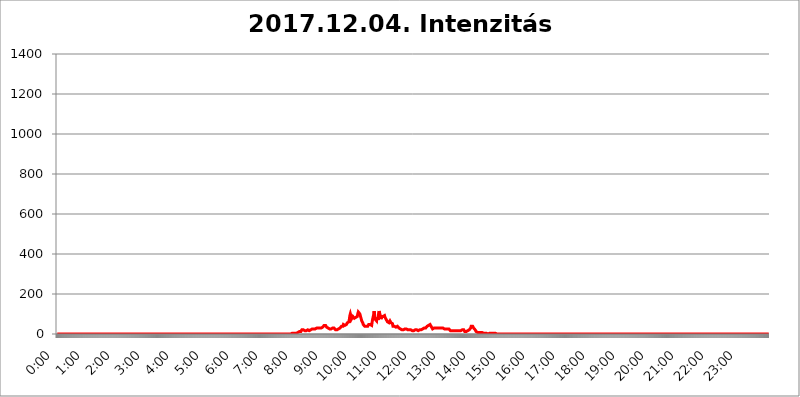
| Category | 2017.12.04. Intenzitás [W/m^2] |
|---|---|
| 0.0 | 0 |
| 0.0006944444444444445 | 0 |
| 0.001388888888888889 | 0 |
| 0.0020833333333333333 | 0 |
| 0.002777777777777778 | 0 |
| 0.003472222222222222 | 0 |
| 0.004166666666666667 | 0 |
| 0.004861111111111111 | 0 |
| 0.005555555555555556 | 0 |
| 0.0062499999999999995 | 0 |
| 0.006944444444444444 | 0 |
| 0.007638888888888889 | 0 |
| 0.008333333333333333 | 0 |
| 0.009027777777777779 | 0 |
| 0.009722222222222222 | 0 |
| 0.010416666666666666 | 0 |
| 0.011111111111111112 | 0 |
| 0.011805555555555555 | 0 |
| 0.012499999999999999 | 0 |
| 0.013194444444444444 | 0 |
| 0.013888888888888888 | 0 |
| 0.014583333333333332 | 0 |
| 0.015277777777777777 | 0 |
| 0.015972222222222224 | 0 |
| 0.016666666666666666 | 0 |
| 0.017361111111111112 | 0 |
| 0.018055555555555557 | 0 |
| 0.01875 | 0 |
| 0.019444444444444445 | 0 |
| 0.02013888888888889 | 0 |
| 0.020833333333333332 | 0 |
| 0.02152777777777778 | 0 |
| 0.022222222222222223 | 0 |
| 0.02291666666666667 | 0 |
| 0.02361111111111111 | 0 |
| 0.024305555555555556 | 0 |
| 0.024999999999999998 | 0 |
| 0.025694444444444447 | 0 |
| 0.02638888888888889 | 0 |
| 0.027083333333333334 | 0 |
| 0.027777777777777776 | 0 |
| 0.02847222222222222 | 0 |
| 0.029166666666666664 | 0 |
| 0.029861111111111113 | 0 |
| 0.030555555555555555 | 0 |
| 0.03125 | 0 |
| 0.03194444444444445 | 0 |
| 0.03263888888888889 | 0 |
| 0.03333333333333333 | 0 |
| 0.034027777777777775 | 0 |
| 0.034722222222222224 | 0 |
| 0.035416666666666666 | 0 |
| 0.036111111111111115 | 0 |
| 0.03680555555555556 | 0 |
| 0.0375 | 0 |
| 0.03819444444444444 | 0 |
| 0.03888888888888889 | 0 |
| 0.03958333333333333 | 0 |
| 0.04027777777777778 | 0 |
| 0.04097222222222222 | 0 |
| 0.041666666666666664 | 0 |
| 0.042361111111111106 | 0 |
| 0.04305555555555556 | 0 |
| 0.043750000000000004 | 0 |
| 0.044444444444444446 | 0 |
| 0.04513888888888889 | 0 |
| 0.04583333333333334 | 0 |
| 0.04652777777777778 | 0 |
| 0.04722222222222222 | 0 |
| 0.04791666666666666 | 0 |
| 0.04861111111111111 | 0 |
| 0.049305555555555554 | 0 |
| 0.049999999999999996 | 0 |
| 0.05069444444444445 | 0 |
| 0.051388888888888894 | 0 |
| 0.052083333333333336 | 0 |
| 0.05277777777777778 | 0 |
| 0.05347222222222222 | 0 |
| 0.05416666666666667 | 0 |
| 0.05486111111111111 | 0 |
| 0.05555555555555555 | 0 |
| 0.05625 | 0 |
| 0.05694444444444444 | 0 |
| 0.057638888888888885 | 0 |
| 0.05833333333333333 | 0 |
| 0.05902777777777778 | 0 |
| 0.059722222222222225 | 0 |
| 0.06041666666666667 | 0 |
| 0.061111111111111116 | 0 |
| 0.06180555555555556 | 0 |
| 0.0625 | 0 |
| 0.06319444444444444 | 0 |
| 0.06388888888888888 | 0 |
| 0.06458333333333334 | 0 |
| 0.06527777777777778 | 0 |
| 0.06597222222222222 | 0 |
| 0.06666666666666667 | 0 |
| 0.06736111111111111 | 0 |
| 0.06805555555555555 | 0 |
| 0.06874999999999999 | 0 |
| 0.06944444444444443 | 0 |
| 0.07013888888888889 | 0 |
| 0.07083333333333333 | 0 |
| 0.07152777777777779 | 0 |
| 0.07222222222222223 | 0 |
| 0.07291666666666667 | 0 |
| 0.07361111111111111 | 0 |
| 0.07430555555555556 | 0 |
| 0.075 | 0 |
| 0.07569444444444444 | 0 |
| 0.0763888888888889 | 0 |
| 0.07708333333333334 | 0 |
| 0.07777777777777778 | 0 |
| 0.07847222222222222 | 0 |
| 0.07916666666666666 | 0 |
| 0.0798611111111111 | 0 |
| 0.08055555555555556 | 0 |
| 0.08125 | 0 |
| 0.08194444444444444 | 0 |
| 0.08263888888888889 | 0 |
| 0.08333333333333333 | 0 |
| 0.08402777777777777 | 0 |
| 0.08472222222222221 | 0 |
| 0.08541666666666665 | 0 |
| 0.08611111111111112 | 0 |
| 0.08680555555555557 | 0 |
| 0.08750000000000001 | 0 |
| 0.08819444444444445 | 0 |
| 0.08888888888888889 | 0 |
| 0.08958333333333333 | 0 |
| 0.09027777777777778 | 0 |
| 0.09097222222222222 | 0 |
| 0.09166666666666667 | 0 |
| 0.09236111111111112 | 0 |
| 0.09305555555555556 | 0 |
| 0.09375 | 0 |
| 0.09444444444444444 | 0 |
| 0.09513888888888888 | 0 |
| 0.09583333333333333 | 0 |
| 0.09652777777777777 | 0 |
| 0.09722222222222222 | 0 |
| 0.09791666666666667 | 0 |
| 0.09861111111111111 | 0 |
| 0.09930555555555555 | 0 |
| 0.09999999999999999 | 0 |
| 0.10069444444444443 | 0 |
| 0.1013888888888889 | 0 |
| 0.10208333333333335 | 0 |
| 0.10277777777777779 | 0 |
| 0.10347222222222223 | 0 |
| 0.10416666666666667 | 0 |
| 0.10486111111111111 | 0 |
| 0.10555555555555556 | 0 |
| 0.10625 | 0 |
| 0.10694444444444444 | 0 |
| 0.1076388888888889 | 0 |
| 0.10833333333333334 | 0 |
| 0.10902777777777778 | 0 |
| 0.10972222222222222 | 0 |
| 0.1111111111111111 | 0 |
| 0.11180555555555556 | 0 |
| 0.11180555555555556 | 0 |
| 0.1125 | 0 |
| 0.11319444444444444 | 0 |
| 0.11388888888888889 | 0 |
| 0.11458333333333333 | 0 |
| 0.11527777777777777 | 0 |
| 0.11597222222222221 | 0 |
| 0.11666666666666665 | 0 |
| 0.1173611111111111 | 0 |
| 0.11805555555555557 | 0 |
| 0.11944444444444445 | 0 |
| 0.12013888888888889 | 0 |
| 0.12083333333333333 | 0 |
| 0.12152777777777778 | 0 |
| 0.12222222222222223 | 0 |
| 0.12291666666666667 | 0 |
| 0.12291666666666667 | 0 |
| 0.12361111111111112 | 0 |
| 0.12430555555555556 | 0 |
| 0.125 | 0 |
| 0.12569444444444444 | 0 |
| 0.12638888888888888 | 0 |
| 0.12708333333333333 | 0 |
| 0.16875 | 0 |
| 0.12847222222222224 | 0 |
| 0.12916666666666668 | 0 |
| 0.12986111111111112 | 0 |
| 0.13055555555555556 | 0 |
| 0.13125 | 0 |
| 0.13194444444444445 | 0 |
| 0.1326388888888889 | 0 |
| 0.13333333333333333 | 0 |
| 0.13402777777777777 | 0 |
| 0.13402777777777777 | 0 |
| 0.13472222222222222 | 0 |
| 0.13541666666666666 | 0 |
| 0.1361111111111111 | 0 |
| 0.13749999999999998 | 0 |
| 0.13819444444444443 | 0 |
| 0.1388888888888889 | 0 |
| 0.13958333333333334 | 0 |
| 0.14027777777777778 | 0 |
| 0.14097222222222222 | 0 |
| 0.14166666666666666 | 0 |
| 0.1423611111111111 | 0 |
| 0.14305555555555557 | 0 |
| 0.14375000000000002 | 0 |
| 0.14444444444444446 | 0 |
| 0.1451388888888889 | 0 |
| 0.1451388888888889 | 0 |
| 0.14652777777777778 | 0 |
| 0.14722222222222223 | 0 |
| 0.14791666666666667 | 0 |
| 0.1486111111111111 | 0 |
| 0.14930555555555555 | 0 |
| 0.15 | 0 |
| 0.15069444444444444 | 0 |
| 0.15138888888888888 | 0 |
| 0.15208333333333332 | 0 |
| 0.15277777777777776 | 0 |
| 0.15347222222222223 | 0 |
| 0.15416666666666667 | 0 |
| 0.15486111111111112 | 0 |
| 0.15555555555555556 | 0 |
| 0.15625 | 0 |
| 0.15694444444444444 | 0 |
| 0.15763888888888888 | 0 |
| 0.15833333333333333 | 0 |
| 0.15902777777777777 | 0 |
| 0.15972222222222224 | 0 |
| 0.16041666666666668 | 0 |
| 0.16111111111111112 | 0 |
| 0.16180555555555556 | 0 |
| 0.1625 | 0 |
| 0.16319444444444445 | 0 |
| 0.1638888888888889 | 0 |
| 0.16458333333333333 | 0 |
| 0.16527777777777777 | 0 |
| 0.16597222222222222 | 0 |
| 0.16666666666666666 | 0 |
| 0.1673611111111111 | 0 |
| 0.16805555555555554 | 0 |
| 0.16874999999999998 | 0 |
| 0.16944444444444443 | 0 |
| 0.17013888888888887 | 0 |
| 0.1708333333333333 | 0 |
| 0.17152777777777775 | 0 |
| 0.17222222222222225 | 0 |
| 0.1729166666666667 | 0 |
| 0.17361111111111113 | 0 |
| 0.17430555555555557 | 0 |
| 0.17500000000000002 | 0 |
| 0.17569444444444446 | 0 |
| 0.1763888888888889 | 0 |
| 0.17708333333333334 | 0 |
| 0.17777777777777778 | 0 |
| 0.17847222222222223 | 0 |
| 0.17916666666666667 | 0 |
| 0.1798611111111111 | 0 |
| 0.18055555555555555 | 0 |
| 0.18125 | 0 |
| 0.18194444444444444 | 0 |
| 0.1826388888888889 | 0 |
| 0.18333333333333335 | 0 |
| 0.1840277777777778 | 0 |
| 0.18472222222222223 | 0 |
| 0.18541666666666667 | 0 |
| 0.18611111111111112 | 0 |
| 0.18680555555555556 | 0 |
| 0.1875 | 0 |
| 0.18819444444444444 | 0 |
| 0.18888888888888888 | 0 |
| 0.18958333333333333 | 0 |
| 0.19027777777777777 | 0 |
| 0.1909722222222222 | 0 |
| 0.19166666666666665 | 0 |
| 0.19236111111111112 | 0 |
| 0.19305555555555554 | 0 |
| 0.19375 | 0 |
| 0.19444444444444445 | 0 |
| 0.1951388888888889 | 0 |
| 0.19583333333333333 | 0 |
| 0.19652777777777777 | 0 |
| 0.19722222222222222 | 0 |
| 0.19791666666666666 | 0 |
| 0.1986111111111111 | 0 |
| 0.19930555555555554 | 0 |
| 0.19999999999999998 | 0 |
| 0.20069444444444443 | 0 |
| 0.20138888888888887 | 0 |
| 0.2020833333333333 | 0 |
| 0.2027777777777778 | 0 |
| 0.2034722222222222 | 0 |
| 0.2041666666666667 | 0 |
| 0.20486111111111113 | 0 |
| 0.20555555555555557 | 0 |
| 0.20625000000000002 | 0 |
| 0.20694444444444446 | 0 |
| 0.2076388888888889 | 0 |
| 0.20833333333333334 | 0 |
| 0.20902777777777778 | 0 |
| 0.20972222222222223 | 0 |
| 0.21041666666666667 | 0 |
| 0.2111111111111111 | 0 |
| 0.21180555555555555 | 0 |
| 0.2125 | 0 |
| 0.21319444444444444 | 0 |
| 0.2138888888888889 | 0 |
| 0.21458333333333335 | 0 |
| 0.2152777777777778 | 0 |
| 0.21597222222222223 | 0 |
| 0.21666666666666667 | 0 |
| 0.21736111111111112 | 0 |
| 0.21805555555555556 | 0 |
| 0.21875 | 0 |
| 0.21944444444444444 | 0 |
| 0.22013888888888888 | 0 |
| 0.22083333333333333 | 0 |
| 0.22152777777777777 | 0 |
| 0.2222222222222222 | 0 |
| 0.22291666666666665 | 0 |
| 0.2236111111111111 | 0 |
| 0.22430555555555556 | 0 |
| 0.225 | 0 |
| 0.22569444444444445 | 0 |
| 0.2263888888888889 | 0 |
| 0.22708333333333333 | 0 |
| 0.22777777777777777 | 0 |
| 0.22847222222222222 | 0 |
| 0.22916666666666666 | 0 |
| 0.2298611111111111 | 0 |
| 0.23055555555555554 | 0 |
| 0.23124999999999998 | 0 |
| 0.23194444444444443 | 0 |
| 0.23263888888888887 | 0 |
| 0.2333333333333333 | 0 |
| 0.2340277777777778 | 0 |
| 0.2347222222222222 | 0 |
| 0.2354166666666667 | 0 |
| 0.23611111111111113 | 0 |
| 0.23680555555555557 | 0 |
| 0.23750000000000002 | 0 |
| 0.23819444444444446 | 0 |
| 0.2388888888888889 | 0 |
| 0.23958333333333334 | 0 |
| 0.24027777777777778 | 0 |
| 0.24097222222222223 | 0 |
| 0.24166666666666667 | 0 |
| 0.2423611111111111 | 0 |
| 0.24305555555555555 | 0 |
| 0.24375 | 0 |
| 0.24444444444444446 | 0 |
| 0.24513888888888888 | 0 |
| 0.24583333333333335 | 0 |
| 0.2465277777777778 | 0 |
| 0.24722222222222223 | 0 |
| 0.24791666666666667 | 0 |
| 0.24861111111111112 | 0 |
| 0.24930555555555556 | 0 |
| 0.25 | 0 |
| 0.25069444444444444 | 0 |
| 0.2513888888888889 | 0 |
| 0.2520833333333333 | 0 |
| 0.25277777777777777 | 0 |
| 0.2534722222222222 | 0 |
| 0.25416666666666665 | 0 |
| 0.2548611111111111 | 0 |
| 0.2555555555555556 | 0 |
| 0.25625000000000003 | 0 |
| 0.2569444444444445 | 0 |
| 0.2576388888888889 | 0 |
| 0.25833333333333336 | 0 |
| 0.2590277777777778 | 0 |
| 0.25972222222222224 | 0 |
| 0.2604166666666667 | 0 |
| 0.2611111111111111 | 0 |
| 0.26180555555555557 | 0 |
| 0.2625 | 0 |
| 0.26319444444444445 | 0 |
| 0.2638888888888889 | 0 |
| 0.26458333333333334 | 0 |
| 0.2652777777777778 | 0 |
| 0.2659722222222222 | 0 |
| 0.26666666666666666 | 0 |
| 0.2673611111111111 | 0 |
| 0.26805555555555555 | 0 |
| 0.26875 | 0 |
| 0.26944444444444443 | 0 |
| 0.2701388888888889 | 0 |
| 0.2708333333333333 | 0 |
| 0.27152777777777776 | 0 |
| 0.2722222222222222 | 0 |
| 0.27291666666666664 | 0 |
| 0.2736111111111111 | 0 |
| 0.2743055555555555 | 0 |
| 0.27499999999999997 | 0 |
| 0.27569444444444446 | 0 |
| 0.27638888888888885 | 0 |
| 0.27708333333333335 | 0 |
| 0.2777777777777778 | 0 |
| 0.27847222222222223 | 0 |
| 0.2791666666666667 | 0 |
| 0.2798611111111111 | 0 |
| 0.28055555555555556 | 0 |
| 0.28125 | 0 |
| 0.28194444444444444 | 0 |
| 0.2826388888888889 | 0 |
| 0.2833333333333333 | 0 |
| 0.28402777777777777 | 0 |
| 0.2847222222222222 | 0 |
| 0.28541666666666665 | 0 |
| 0.28611111111111115 | 0 |
| 0.28680555555555554 | 0 |
| 0.28750000000000003 | 0 |
| 0.2881944444444445 | 0 |
| 0.2888888888888889 | 0 |
| 0.28958333333333336 | 0 |
| 0.2902777777777778 | 0 |
| 0.29097222222222224 | 0 |
| 0.2916666666666667 | 0 |
| 0.2923611111111111 | 0 |
| 0.29305555555555557 | 0 |
| 0.29375 | 0 |
| 0.29444444444444445 | 0 |
| 0.2951388888888889 | 0 |
| 0.29583333333333334 | 0 |
| 0.2965277777777778 | 0 |
| 0.2972222222222222 | 0 |
| 0.29791666666666666 | 0 |
| 0.2986111111111111 | 0 |
| 0.29930555555555555 | 0 |
| 0.3 | 0 |
| 0.30069444444444443 | 0 |
| 0.3013888888888889 | 0 |
| 0.3020833333333333 | 0 |
| 0.30277777777777776 | 0 |
| 0.3034722222222222 | 0 |
| 0.30416666666666664 | 0 |
| 0.3048611111111111 | 0 |
| 0.3055555555555555 | 0 |
| 0.30624999999999997 | 0 |
| 0.3069444444444444 | 0 |
| 0.3076388888888889 | 0 |
| 0.30833333333333335 | 0 |
| 0.3090277777777778 | 0 |
| 0.30972222222222223 | 0 |
| 0.3104166666666667 | 0 |
| 0.3111111111111111 | 0 |
| 0.31180555555555556 | 0 |
| 0.3125 | 0 |
| 0.31319444444444444 | 0 |
| 0.3138888888888889 | 0 |
| 0.3145833333333333 | 0 |
| 0.31527777777777777 | 0 |
| 0.3159722222222222 | 0 |
| 0.31666666666666665 | 0 |
| 0.31736111111111115 | 0 |
| 0.31805555555555554 | 0 |
| 0.31875000000000003 | 0 |
| 0.3194444444444445 | 0 |
| 0.3201388888888889 | 0 |
| 0.32083333333333336 | 0 |
| 0.3215277777777778 | 0 |
| 0.32222222222222224 | 0 |
| 0.3229166666666667 | 0 |
| 0.3236111111111111 | 0 |
| 0.32430555555555557 | 3.525 |
| 0.325 | 0 |
| 0.32569444444444445 | 0 |
| 0.3263888888888889 | 0 |
| 0.32708333333333334 | 0 |
| 0.3277777777777778 | 0 |
| 0.3284722222222222 | 0 |
| 0.32916666666666666 | 3.525 |
| 0.3298611111111111 | 3.525 |
| 0.33055555555555555 | 3.525 |
| 0.33125 | 3.525 |
| 0.33194444444444443 | 3.525 |
| 0.3326388888888889 | 3.525 |
| 0.3333333333333333 | 3.525 |
| 0.3340277777777778 | 3.525 |
| 0.3347222222222222 | 3.525 |
| 0.3354166666666667 | 3.525 |
| 0.3361111111111111 | 7.887 |
| 0.3368055555555556 | 7.887 |
| 0.33749999999999997 | 7.887 |
| 0.33819444444444446 | 12.257 |
| 0.33888888888888885 | 12.257 |
| 0.33958333333333335 | 12.257 |
| 0.34027777777777773 | 12.257 |
| 0.34097222222222223 | 12.257 |
| 0.3416666666666666 | 12.257 |
| 0.3423611111111111 | 16.636 |
| 0.3430555555555555 | 21.024 |
| 0.34375 | 21.024 |
| 0.3444444444444445 | 21.024 |
| 0.3451388888888889 | 21.024 |
| 0.3458333333333334 | 16.636 |
| 0.34652777777777777 | 16.636 |
| 0.34722222222222227 | 16.636 |
| 0.34791666666666665 | 16.636 |
| 0.34861111111111115 | 16.636 |
| 0.34930555555555554 | 16.636 |
| 0.35000000000000003 | 16.636 |
| 0.3506944444444444 | 21.024 |
| 0.3513888888888889 | 21.024 |
| 0.3520833333333333 | 16.636 |
| 0.3527777777777778 | 16.636 |
| 0.3534722222222222 | 16.636 |
| 0.3541666666666667 | 16.636 |
| 0.3548611111111111 | 16.636 |
| 0.35555555555555557 | 21.024 |
| 0.35625 | 21.024 |
| 0.35694444444444445 | 21.024 |
| 0.3576388888888889 | 25.419 |
| 0.35833333333333334 | 25.419 |
| 0.3590277777777778 | 25.419 |
| 0.3597222222222222 | 25.419 |
| 0.36041666666666666 | 25.419 |
| 0.3611111111111111 | 25.419 |
| 0.36180555555555555 | 25.419 |
| 0.3625 | 25.419 |
| 0.36319444444444443 | 25.419 |
| 0.3638888888888889 | 29.823 |
| 0.3645833333333333 | 25.419 |
| 0.3652777777777778 | 25.419 |
| 0.3659722222222222 | 29.823 |
| 0.3666666666666667 | 29.823 |
| 0.3673611111111111 | 29.823 |
| 0.3680555555555556 | 29.823 |
| 0.36874999999999997 | 29.823 |
| 0.36944444444444446 | 29.823 |
| 0.37013888888888885 | 29.823 |
| 0.37083333333333335 | 29.823 |
| 0.37152777777777773 | 29.823 |
| 0.37222222222222223 | 34.234 |
| 0.3729166666666666 | 38.653 |
| 0.3736111111111111 | 38.653 |
| 0.3743055555555555 | 43.079 |
| 0.375 | 43.079 |
| 0.3756944444444445 | 43.079 |
| 0.3763888888888889 | 43.079 |
| 0.3770833333333334 | 43.079 |
| 0.37777777777777777 | 34.234 |
| 0.37847222222222227 | 29.823 |
| 0.37916666666666665 | 29.823 |
| 0.37986111111111115 | 29.823 |
| 0.38055555555555554 | 25.419 |
| 0.38125000000000003 | 25.419 |
| 0.3819444444444444 | 25.419 |
| 0.3826388888888889 | 25.419 |
| 0.3833333333333333 | 25.419 |
| 0.3840277777777778 | 25.419 |
| 0.3847222222222222 | 29.823 |
| 0.3854166666666667 | 29.823 |
| 0.3861111111111111 | 29.823 |
| 0.38680555555555557 | 29.823 |
| 0.3875 | 29.823 |
| 0.38819444444444445 | 29.823 |
| 0.3888888888888889 | 29.823 |
| 0.38958333333333334 | 25.419 |
| 0.3902777777777778 | 21.024 |
| 0.3909722222222222 | 21.024 |
| 0.39166666666666666 | 21.024 |
| 0.3923611111111111 | 21.024 |
| 0.39305555555555555 | 21.024 |
| 0.39375 | 21.024 |
| 0.39444444444444443 | 25.419 |
| 0.3951388888888889 | 25.419 |
| 0.3958333333333333 | 29.823 |
| 0.3965277777777778 | 29.823 |
| 0.3972222222222222 | 29.823 |
| 0.3979166666666667 | 34.234 |
| 0.3986111111111111 | 38.653 |
| 0.3993055555555556 | 38.653 |
| 0.39999999999999997 | 38.653 |
| 0.40069444444444446 | 38.653 |
| 0.40138888888888885 | 47.511 |
| 0.40208333333333335 | 47.511 |
| 0.40277777777777773 | 47.511 |
| 0.40347222222222223 | 43.079 |
| 0.4041666666666666 | 38.653 |
| 0.4048611111111111 | 43.079 |
| 0.4055555555555555 | 47.511 |
| 0.40625 | 51.951 |
| 0.4069444444444445 | 56.398 |
| 0.4076388888888889 | 56.398 |
| 0.4083333333333334 | 51.951 |
| 0.40902777777777777 | 60.85 |
| 0.40972222222222227 | 74.246 |
| 0.41041666666666665 | 92.184 |
| 0.41111111111111115 | 101.184 |
| 0.41180555555555554 | 92.184 |
| 0.41250000000000003 | 74.246 |
| 0.4131944444444444 | 74.246 |
| 0.4138888888888889 | 78.722 |
| 0.4145833333333333 | 87.692 |
| 0.4152777777777778 | 87.692 |
| 0.4159722222222222 | 83.205 |
| 0.4166666666666667 | 78.722 |
| 0.4173611111111111 | 74.246 |
| 0.41805555555555557 | 74.246 |
| 0.41875 | 83.205 |
| 0.41944444444444445 | 83.205 |
| 0.4201388888888889 | 83.205 |
| 0.42083333333333334 | 87.692 |
| 0.4215277777777778 | 101.184 |
| 0.4222222222222222 | 110.201 |
| 0.42291666666666666 | 114.716 |
| 0.4236111111111111 | 110.201 |
| 0.42430555555555555 | 101.184 |
| 0.425 | 96.682 |
| 0.42569444444444443 | 83.205 |
| 0.4263888888888889 | 74.246 |
| 0.4270833333333333 | 65.31 |
| 0.4277777777777778 | 60.85 |
| 0.4284722222222222 | 56.398 |
| 0.4291666666666667 | 47.511 |
| 0.4298611111111111 | 47.511 |
| 0.4305555555555556 | 43.079 |
| 0.43124999999999997 | 38.653 |
| 0.43194444444444446 | 38.653 |
| 0.43263888888888885 | 38.653 |
| 0.43333333333333335 | 38.653 |
| 0.43402777777777773 | 38.653 |
| 0.43472222222222223 | 38.653 |
| 0.4354166666666666 | 38.653 |
| 0.4361111111111111 | 43.079 |
| 0.4368055555555555 | 47.511 |
| 0.4375 | 43.079 |
| 0.4381944444444445 | 47.511 |
| 0.4388888888888889 | 47.511 |
| 0.4395833333333334 | 47.511 |
| 0.44027777777777777 | 47.511 |
| 0.44097222222222227 | 43.079 |
| 0.44166666666666665 | 60.85 |
| 0.44236111111111115 | 74.246 |
| 0.44305555555555554 | 74.246 |
| 0.44375000000000003 | 96.682 |
| 0.4444444444444444 | 114.716 |
| 0.4451388888888889 | 96.682 |
| 0.4458333333333333 | 74.246 |
| 0.4465277777777778 | 69.775 |
| 0.4472222222222222 | 78.722 |
| 0.4479166666666667 | 65.31 |
| 0.4486111111111111 | 83.205 |
| 0.44930555555555557 | 78.722 |
| 0.45 | 69.775 |
| 0.45069444444444445 | 101.184 |
| 0.4513888888888889 | 114.716 |
| 0.45208333333333334 | 105.69 |
| 0.4527777777777778 | 110.201 |
| 0.4534722222222222 | 87.692 |
| 0.45416666666666666 | 74.246 |
| 0.4548611111111111 | 87.692 |
| 0.45555555555555555 | 83.205 |
| 0.45625 | 92.184 |
| 0.45694444444444443 | 87.692 |
| 0.4576388888888889 | 83.205 |
| 0.4583333333333333 | 92.184 |
| 0.4590277777777778 | 92.184 |
| 0.4597222222222222 | 83.205 |
| 0.4604166666666667 | 78.722 |
| 0.4611111111111111 | 78.722 |
| 0.4618055555555556 | 69.775 |
| 0.46249999999999997 | 65.31 |
| 0.46319444444444446 | 60.85 |
| 0.46388888888888885 | 60.85 |
| 0.46458333333333335 | 56.398 |
| 0.46527777777777773 | 56.398 |
| 0.46597222222222223 | 60.85 |
| 0.4666666666666666 | 65.31 |
| 0.4673611111111111 | 60.85 |
| 0.4680555555555555 | 56.398 |
| 0.46875 | 60.85 |
| 0.4694444444444445 | 60.85 |
| 0.4701388888888889 | 51.951 |
| 0.4708333333333334 | 38.653 |
| 0.47152777777777777 | 38.653 |
| 0.47222222222222227 | 38.653 |
| 0.47291666666666665 | 38.653 |
| 0.47361111111111115 | 34.234 |
| 0.47430555555555554 | 34.234 |
| 0.47500000000000003 | 34.234 |
| 0.4756944444444444 | 34.234 |
| 0.4763888888888889 | 38.653 |
| 0.4770833333333333 | 38.653 |
| 0.4777777777777778 | 38.653 |
| 0.4784722222222222 | 34.234 |
| 0.4791666666666667 | 29.823 |
| 0.4798611111111111 | 29.823 |
| 0.48055555555555557 | 29.823 |
| 0.48125 | 25.419 |
| 0.48194444444444445 | 25.419 |
| 0.4826388888888889 | 25.419 |
| 0.48333333333333334 | 21.024 |
| 0.4840277777777778 | 21.024 |
| 0.4847222222222222 | 21.024 |
| 0.48541666666666666 | 21.024 |
| 0.4861111111111111 | 21.024 |
| 0.48680555555555555 | 21.024 |
| 0.4875 | 25.419 |
| 0.48819444444444443 | 29.823 |
| 0.4888888888888889 | 29.823 |
| 0.4895833333333333 | 25.419 |
| 0.4902777777777778 | 25.419 |
| 0.4909722222222222 | 21.024 |
| 0.4916666666666667 | 21.024 |
| 0.4923611111111111 | 21.024 |
| 0.4930555555555556 | 21.024 |
| 0.49374999999999997 | 21.024 |
| 0.49444444444444446 | 21.024 |
| 0.49513888888888885 | 21.024 |
| 0.49583333333333335 | 21.024 |
| 0.49652777777777773 | 21.024 |
| 0.49722222222222223 | 21.024 |
| 0.4979166666666666 | 16.636 |
| 0.4986111111111111 | 16.636 |
| 0.4993055555555555 | 16.636 |
| 0.5 | 16.636 |
| 0.5006944444444444 | 21.024 |
| 0.5013888888888889 | 16.636 |
| 0.5020833333333333 | 21.024 |
| 0.5027777777777778 | 21.024 |
| 0.5034722222222222 | 21.024 |
| 0.5041666666666667 | 21.024 |
| 0.5048611111111111 | 21.024 |
| 0.5055555555555555 | 21.024 |
| 0.50625 | 16.636 |
| 0.5069444444444444 | 16.636 |
| 0.5076388888888889 | 16.636 |
| 0.5083333333333333 | 21.024 |
| 0.5090277777777777 | 21.024 |
| 0.5097222222222222 | 21.024 |
| 0.5104166666666666 | 21.024 |
| 0.5111111111111112 | 21.024 |
| 0.5118055555555555 | 25.419 |
| 0.5125000000000001 | 25.419 |
| 0.5131944444444444 | 25.419 |
| 0.513888888888889 | 25.419 |
| 0.5145833333333333 | 29.823 |
| 0.5152777777777778 | 29.823 |
| 0.5159722222222222 | 34.234 |
| 0.5166666666666667 | 29.823 |
| 0.517361111111111 | 34.234 |
| 0.5180555555555556 | 34.234 |
| 0.5187499999999999 | 38.653 |
| 0.5194444444444445 | 38.653 |
| 0.5201388888888888 | 43.079 |
| 0.5208333333333334 | 43.079 |
| 0.5215277777777778 | 47.511 |
| 0.5222222222222223 | 47.511 |
| 0.5229166666666667 | 47.511 |
| 0.5236111111111111 | 47.511 |
| 0.5243055555555556 | 47.511 |
| 0.525 | 34.234 |
| 0.5256944444444445 | 29.823 |
| 0.5263888888888889 | 25.419 |
| 0.5270833333333333 | 25.419 |
| 0.5277777777777778 | 29.823 |
| 0.5284722222222222 | 29.823 |
| 0.5291666666666667 | 34.234 |
| 0.5298611111111111 | 29.823 |
| 0.5305555555555556 | 29.823 |
| 0.53125 | 29.823 |
| 0.5319444444444444 | 29.823 |
| 0.5326388888888889 | 29.823 |
| 0.5333333333333333 | 29.823 |
| 0.5340277777777778 | 29.823 |
| 0.5347222222222222 | 29.823 |
| 0.5354166666666667 | 29.823 |
| 0.5361111111111111 | 29.823 |
| 0.5368055555555555 | 29.823 |
| 0.5375 | 29.823 |
| 0.5381944444444444 | 29.823 |
| 0.5388888888888889 | 29.823 |
| 0.5395833333333333 | 29.823 |
| 0.5402777777777777 | 29.823 |
| 0.5409722222222222 | 29.823 |
| 0.5416666666666666 | 25.419 |
| 0.5423611111111112 | 25.419 |
| 0.5430555555555555 | 25.419 |
| 0.5437500000000001 | 25.419 |
| 0.5444444444444444 | 25.419 |
| 0.545138888888889 | 25.419 |
| 0.5458333333333333 | 25.419 |
| 0.5465277777777778 | 29.823 |
| 0.5472222222222222 | 25.419 |
| 0.5479166666666667 | 25.419 |
| 0.548611111111111 | 25.419 |
| 0.5493055555555556 | 25.419 |
| 0.5499999999999999 | 21.024 |
| 0.5506944444444445 | 21.024 |
| 0.5513888888888888 | 16.636 |
| 0.5520833333333334 | 16.636 |
| 0.5527777777777778 | 16.636 |
| 0.5534722222222223 | 16.636 |
| 0.5541666666666667 | 16.636 |
| 0.5548611111111111 | 16.636 |
| 0.5555555555555556 | 16.636 |
| 0.55625 | 12.257 |
| 0.5569444444444445 | 12.257 |
| 0.5576388888888889 | 16.636 |
| 0.5583333333333333 | 16.636 |
| 0.5590277777777778 | 21.024 |
| 0.5597222222222222 | 16.636 |
| 0.5604166666666667 | 16.636 |
| 0.5611111111111111 | 21.024 |
| 0.5618055555555556 | 16.636 |
| 0.5625 | 16.636 |
| 0.5631944444444444 | 16.636 |
| 0.5638888888888889 | 16.636 |
| 0.5645833333333333 | 16.636 |
| 0.5652777777777778 | 16.636 |
| 0.5659722222222222 | 16.636 |
| 0.5666666666666667 | 16.636 |
| 0.5673611111111111 | 21.024 |
| 0.5680555555555555 | 21.024 |
| 0.56875 | 21.024 |
| 0.5694444444444444 | 21.024 |
| 0.5701388888888889 | 21.024 |
| 0.5708333333333333 | 16.636 |
| 0.5715277777777777 | 12.257 |
| 0.5722222222222222 | 12.257 |
| 0.5729166666666666 | 12.257 |
| 0.5736111111111112 | 12.257 |
| 0.5743055555555555 | 12.257 |
| 0.5750000000000001 | 16.636 |
| 0.5756944444444444 | 16.636 |
| 0.576388888888889 | 21.024 |
| 0.5770833333333333 | 21.024 |
| 0.5777777777777778 | 21.024 |
| 0.5784722222222222 | 25.419 |
| 0.5791666666666667 | 25.419 |
| 0.579861111111111 | 29.823 |
| 0.5805555555555556 | 38.653 |
| 0.5812499999999999 | 38.653 |
| 0.5819444444444445 | 38.653 |
| 0.5826388888888888 | 38.653 |
| 0.5833333333333334 | 34.234 |
| 0.5840277777777778 | 29.823 |
| 0.5847222222222223 | 25.419 |
| 0.5854166666666667 | 25.419 |
| 0.5861111111111111 | 21.024 |
| 0.5868055555555556 | 16.636 |
| 0.5875 | 12.257 |
| 0.5881944444444445 | 12.257 |
| 0.5888888888888889 | 7.887 |
| 0.5895833333333333 | 7.887 |
| 0.5902777777777778 | 7.887 |
| 0.5909722222222222 | 7.887 |
| 0.5916666666666667 | 7.887 |
| 0.5923611111111111 | 7.887 |
| 0.5930555555555556 | 7.887 |
| 0.59375 | 7.887 |
| 0.5944444444444444 | 3.525 |
| 0.5951388888888889 | 7.887 |
| 0.5958333333333333 | 7.887 |
| 0.5965277777777778 | 3.525 |
| 0.5972222222222222 | 3.525 |
| 0.5979166666666667 | 3.525 |
| 0.5986111111111111 | 3.525 |
| 0.5993055555555555 | 3.525 |
| 0.6 | 3.525 |
| 0.6006944444444444 | 3.525 |
| 0.6013888888888889 | 3.525 |
| 0.6020833333333333 | 3.525 |
| 0.6027777777777777 | 3.525 |
| 0.6034722222222222 | 3.525 |
| 0.6041666666666666 | 0 |
| 0.6048611111111112 | 3.525 |
| 0.6055555555555555 | 3.525 |
| 0.6062500000000001 | 3.525 |
| 0.6069444444444444 | 3.525 |
| 0.607638888888889 | 3.525 |
| 0.6083333333333333 | 3.525 |
| 0.6090277777777778 | 3.525 |
| 0.6097222222222222 | 3.525 |
| 0.6104166666666667 | 3.525 |
| 0.611111111111111 | 3.525 |
| 0.6118055555555556 | 3.525 |
| 0.6124999999999999 | 3.525 |
| 0.6131944444444445 | 3.525 |
| 0.6138888888888888 | 3.525 |
| 0.6145833333333334 | 3.525 |
| 0.6152777777777778 | 3.525 |
| 0.6159722222222223 | 3.525 |
| 0.6166666666666667 | 0 |
| 0.6173611111111111 | 0 |
| 0.6180555555555556 | 0 |
| 0.61875 | 0 |
| 0.6194444444444445 | 0 |
| 0.6201388888888889 | 0 |
| 0.6208333333333333 | 0 |
| 0.6215277777777778 | 0 |
| 0.6222222222222222 | 0 |
| 0.6229166666666667 | 0 |
| 0.6236111111111111 | 0 |
| 0.6243055555555556 | 0 |
| 0.625 | 0 |
| 0.6256944444444444 | 0 |
| 0.6263888888888889 | 0 |
| 0.6270833333333333 | 0 |
| 0.6277777777777778 | 0 |
| 0.6284722222222222 | 0 |
| 0.6291666666666667 | 0 |
| 0.6298611111111111 | 0 |
| 0.6305555555555555 | 0 |
| 0.63125 | 0 |
| 0.6319444444444444 | 0 |
| 0.6326388888888889 | 0 |
| 0.6333333333333333 | 0 |
| 0.6340277777777777 | 0 |
| 0.6347222222222222 | 0 |
| 0.6354166666666666 | 0 |
| 0.6361111111111112 | 0 |
| 0.6368055555555555 | 0 |
| 0.6375000000000001 | 0 |
| 0.6381944444444444 | 0 |
| 0.638888888888889 | 0 |
| 0.6395833333333333 | 0 |
| 0.6402777777777778 | 0 |
| 0.6409722222222222 | 0 |
| 0.6416666666666667 | 0 |
| 0.642361111111111 | 0 |
| 0.6430555555555556 | 0 |
| 0.6437499999999999 | 0 |
| 0.6444444444444445 | 0 |
| 0.6451388888888888 | 0 |
| 0.6458333333333334 | 0 |
| 0.6465277777777778 | 0 |
| 0.6472222222222223 | 0 |
| 0.6479166666666667 | 0 |
| 0.6486111111111111 | 0 |
| 0.6493055555555556 | 0 |
| 0.65 | 0 |
| 0.6506944444444445 | 0 |
| 0.6513888888888889 | 0 |
| 0.6520833333333333 | 0 |
| 0.6527777777777778 | 0 |
| 0.6534722222222222 | 0 |
| 0.6541666666666667 | 0 |
| 0.6548611111111111 | 0 |
| 0.6555555555555556 | 0 |
| 0.65625 | 0 |
| 0.6569444444444444 | 0 |
| 0.6576388888888889 | 0 |
| 0.6583333333333333 | 0 |
| 0.6590277777777778 | 0 |
| 0.6597222222222222 | 0 |
| 0.6604166666666667 | 0 |
| 0.6611111111111111 | 0 |
| 0.6618055555555555 | 0 |
| 0.6625 | 0 |
| 0.6631944444444444 | 0 |
| 0.6638888888888889 | 0 |
| 0.6645833333333333 | 0 |
| 0.6652777777777777 | 0 |
| 0.6659722222222222 | 0 |
| 0.6666666666666666 | 0 |
| 0.6673611111111111 | 0 |
| 0.6680555555555556 | 0 |
| 0.6687500000000001 | 0 |
| 0.6694444444444444 | 0 |
| 0.6701388888888888 | 0 |
| 0.6708333333333334 | 0 |
| 0.6715277777777778 | 0 |
| 0.6722222222222222 | 0 |
| 0.6729166666666666 | 0 |
| 0.6736111111111112 | 0 |
| 0.6743055555555556 | 0 |
| 0.6749999999999999 | 0 |
| 0.6756944444444444 | 0 |
| 0.6763888888888889 | 0 |
| 0.6770833333333334 | 0 |
| 0.6777777777777777 | 0 |
| 0.6784722222222223 | 0 |
| 0.6791666666666667 | 0 |
| 0.6798611111111111 | 0 |
| 0.6805555555555555 | 0 |
| 0.68125 | 0 |
| 0.6819444444444445 | 0 |
| 0.6826388888888889 | 0 |
| 0.6833333333333332 | 0 |
| 0.6840277777777778 | 0 |
| 0.6847222222222222 | 0 |
| 0.6854166666666667 | 0 |
| 0.686111111111111 | 0 |
| 0.6868055555555556 | 0 |
| 0.6875 | 0 |
| 0.6881944444444444 | 0 |
| 0.688888888888889 | 0 |
| 0.6895833333333333 | 0 |
| 0.6902777777777778 | 0 |
| 0.6909722222222222 | 0 |
| 0.6916666666666668 | 0 |
| 0.6923611111111111 | 0 |
| 0.6930555555555555 | 0 |
| 0.69375 | 0 |
| 0.6944444444444445 | 0 |
| 0.6951388888888889 | 0 |
| 0.6958333333333333 | 0 |
| 0.6965277777777777 | 0 |
| 0.6972222222222223 | 0 |
| 0.6979166666666666 | 0 |
| 0.6986111111111111 | 0 |
| 0.6993055555555556 | 0 |
| 0.7000000000000001 | 0 |
| 0.7006944444444444 | 0 |
| 0.7013888888888888 | 0 |
| 0.7020833333333334 | 0 |
| 0.7027777777777778 | 0 |
| 0.7034722222222222 | 0 |
| 0.7041666666666666 | 0 |
| 0.7048611111111112 | 0 |
| 0.7055555555555556 | 0 |
| 0.7062499999999999 | 0 |
| 0.7069444444444444 | 0 |
| 0.7076388888888889 | 0 |
| 0.7083333333333334 | 0 |
| 0.7090277777777777 | 0 |
| 0.7097222222222223 | 0 |
| 0.7104166666666667 | 0 |
| 0.7111111111111111 | 0 |
| 0.7118055555555555 | 0 |
| 0.7125 | 0 |
| 0.7131944444444445 | 0 |
| 0.7138888888888889 | 0 |
| 0.7145833333333332 | 0 |
| 0.7152777777777778 | 0 |
| 0.7159722222222222 | 0 |
| 0.7166666666666667 | 0 |
| 0.717361111111111 | 0 |
| 0.7180555555555556 | 0 |
| 0.71875 | 0 |
| 0.7194444444444444 | 0 |
| 0.720138888888889 | 0 |
| 0.7208333333333333 | 0 |
| 0.7215277777777778 | 0 |
| 0.7222222222222222 | 0 |
| 0.7229166666666668 | 0 |
| 0.7236111111111111 | 0 |
| 0.7243055555555555 | 0 |
| 0.725 | 0 |
| 0.7256944444444445 | 0 |
| 0.7263888888888889 | 0 |
| 0.7270833333333333 | 0 |
| 0.7277777777777777 | 0 |
| 0.7284722222222223 | 0 |
| 0.7291666666666666 | 0 |
| 0.7298611111111111 | 0 |
| 0.7305555555555556 | 0 |
| 0.7312500000000001 | 0 |
| 0.7319444444444444 | 0 |
| 0.7326388888888888 | 0 |
| 0.7333333333333334 | 0 |
| 0.7340277777777778 | 0 |
| 0.7347222222222222 | 0 |
| 0.7354166666666666 | 0 |
| 0.7361111111111112 | 0 |
| 0.7368055555555556 | 0 |
| 0.7374999999999999 | 0 |
| 0.7381944444444444 | 0 |
| 0.7388888888888889 | 0 |
| 0.7395833333333334 | 0 |
| 0.7402777777777777 | 0 |
| 0.7409722222222223 | 0 |
| 0.7416666666666667 | 0 |
| 0.7423611111111111 | 0 |
| 0.7430555555555555 | 0 |
| 0.74375 | 0 |
| 0.7444444444444445 | 0 |
| 0.7451388888888889 | 0 |
| 0.7458333333333332 | 0 |
| 0.7465277777777778 | 0 |
| 0.7472222222222222 | 0 |
| 0.7479166666666667 | 0 |
| 0.748611111111111 | 0 |
| 0.7493055555555556 | 0 |
| 0.75 | 0 |
| 0.7506944444444444 | 0 |
| 0.751388888888889 | 0 |
| 0.7520833333333333 | 0 |
| 0.7527777777777778 | 0 |
| 0.7534722222222222 | 0 |
| 0.7541666666666668 | 0 |
| 0.7548611111111111 | 0 |
| 0.7555555555555555 | 0 |
| 0.75625 | 0 |
| 0.7569444444444445 | 0 |
| 0.7576388888888889 | 0 |
| 0.7583333333333333 | 0 |
| 0.7590277777777777 | 0 |
| 0.7597222222222223 | 0 |
| 0.7604166666666666 | 0 |
| 0.7611111111111111 | 0 |
| 0.7618055555555556 | 0 |
| 0.7625000000000001 | 0 |
| 0.7631944444444444 | 0 |
| 0.7638888888888888 | 0 |
| 0.7645833333333334 | 0 |
| 0.7652777777777778 | 0 |
| 0.7659722222222222 | 0 |
| 0.7666666666666666 | 0 |
| 0.7673611111111112 | 0 |
| 0.7680555555555556 | 0 |
| 0.7687499999999999 | 0 |
| 0.7694444444444444 | 0 |
| 0.7701388888888889 | 0 |
| 0.7708333333333334 | 0 |
| 0.7715277777777777 | 0 |
| 0.7722222222222223 | 0 |
| 0.7729166666666667 | 0 |
| 0.7736111111111111 | 0 |
| 0.7743055555555555 | 0 |
| 0.775 | 0 |
| 0.7756944444444445 | 0 |
| 0.7763888888888889 | 0 |
| 0.7770833333333332 | 0 |
| 0.7777777777777778 | 0 |
| 0.7784722222222222 | 0 |
| 0.7791666666666667 | 0 |
| 0.779861111111111 | 0 |
| 0.7805555555555556 | 0 |
| 0.78125 | 0 |
| 0.7819444444444444 | 0 |
| 0.782638888888889 | 0 |
| 0.7833333333333333 | 0 |
| 0.7840277777777778 | 0 |
| 0.7847222222222222 | 0 |
| 0.7854166666666668 | 0 |
| 0.7861111111111111 | 0 |
| 0.7868055555555555 | 0 |
| 0.7875 | 0 |
| 0.7881944444444445 | 0 |
| 0.7888888888888889 | 0 |
| 0.7895833333333333 | 0 |
| 0.7902777777777777 | 0 |
| 0.7909722222222223 | 0 |
| 0.7916666666666666 | 0 |
| 0.7923611111111111 | 0 |
| 0.7930555555555556 | 0 |
| 0.7937500000000001 | 0 |
| 0.7944444444444444 | 0 |
| 0.7951388888888888 | 0 |
| 0.7958333333333334 | 0 |
| 0.7965277777777778 | 0 |
| 0.7972222222222222 | 0 |
| 0.7979166666666666 | 0 |
| 0.7986111111111112 | 0 |
| 0.7993055555555556 | 0 |
| 0.7999999999999999 | 0 |
| 0.8006944444444444 | 0 |
| 0.8013888888888889 | 0 |
| 0.8020833333333334 | 0 |
| 0.8027777777777777 | 0 |
| 0.8034722222222223 | 0 |
| 0.8041666666666667 | 0 |
| 0.8048611111111111 | 0 |
| 0.8055555555555555 | 0 |
| 0.80625 | 0 |
| 0.8069444444444445 | 0 |
| 0.8076388888888889 | 0 |
| 0.8083333333333332 | 0 |
| 0.8090277777777778 | 0 |
| 0.8097222222222222 | 0 |
| 0.8104166666666667 | 0 |
| 0.811111111111111 | 0 |
| 0.8118055555555556 | 0 |
| 0.8125 | 0 |
| 0.8131944444444444 | 0 |
| 0.813888888888889 | 0 |
| 0.8145833333333333 | 0 |
| 0.8152777777777778 | 0 |
| 0.8159722222222222 | 0 |
| 0.8166666666666668 | 0 |
| 0.8173611111111111 | 0 |
| 0.8180555555555555 | 0 |
| 0.81875 | 0 |
| 0.8194444444444445 | 0 |
| 0.8201388888888889 | 0 |
| 0.8208333333333333 | 0 |
| 0.8215277777777777 | 0 |
| 0.8222222222222223 | 0 |
| 0.8229166666666666 | 0 |
| 0.8236111111111111 | 0 |
| 0.8243055555555556 | 0 |
| 0.8250000000000001 | 0 |
| 0.8256944444444444 | 0 |
| 0.8263888888888888 | 0 |
| 0.8270833333333334 | 0 |
| 0.8277777777777778 | 0 |
| 0.8284722222222222 | 0 |
| 0.8291666666666666 | 0 |
| 0.8298611111111112 | 0 |
| 0.8305555555555556 | 0 |
| 0.8312499999999999 | 0 |
| 0.8319444444444444 | 0 |
| 0.8326388888888889 | 0 |
| 0.8333333333333334 | 0 |
| 0.8340277777777777 | 0 |
| 0.8347222222222223 | 0 |
| 0.8354166666666667 | 0 |
| 0.8361111111111111 | 0 |
| 0.8368055555555555 | 0 |
| 0.8375 | 0 |
| 0.8381944444444445 | 0 |
| 0.8388888888888889 | 0 |
| 0.8395833333333332 | 0 |
| 0.8402777777777778 | 0 |
| 0.8409722222222222 | 0 |
| 0.8416666666666667 | 0 |
| 0.842361111111111 | 0 |
| 0.8430555555555556 | 0 |
| 0.84375 | 0 |
| 0.8444444444444444 | 0 |
| 0.845138888888889 | 0 |
| 0.8458333333333333 | 0 |
| 0.8465277777777778 | 0 |
| 0.8472222222222222 | 0 |
| 0.8479166666666668 | 0 |
| 0.8486111111111111 | 0 |
| 0.8493055555555555 | 0 |
| 0.85 | 0 |
| 0.8506944444444445 | 0 |
| 0.8513888888888889 | 0 |
| 0.8520833333333333 | 0 |
| 0.8527777777777777 | 0 |
| 0.8534722222222223 | 0 |
| 0.8541666666666666 | 0 |
| 0.8548611111111111 | 0 |
| 0.8555555555555556 | 0 |
| 0.8562500000000001 | 0 |
| 0.8569444444444444 | 0 |
| 0.8576388888888888 | 0 |
| 0.8583333333333334 | 0 |
| 0.8590277777777778 | 0 |
| 0.8597222222222222 | 0 |
| 0.8604166666666666 | 0 |
| 0.8611111111111112 | 0 |
| 0.8618055555555556 | 0 |
| 0.8624999999999999 | 0 |
| 0.8631944444444444 | 0 |
| 0.8638888888888889 | 0 |
| 0.8645833333333334 | 0 |
| 0.8652777777777777 | 0 |
| 0.8659722222222223 | 0 |
| 0.8666666666666667 | 0 |
| 0.8673611111111111 | 0 |
| 0.8680555555555555 | 0 |
| 0.86875 | 0 |
| 0.8694444444444445 | 0 |
| 0.8701388888888889 | 0 |
| 0.8708333333333332 | 0 |
| 0.8715277777777778 | 0 |
| 0.8722222222222222 | 0 |
| 0.8729166666666667 | 0 |
| 0.873611111111111 | 0 |
| 0.8743055555555556 | 0 |
| 0.875 | 0 |
| 0.8756944444444444 | 0 |
| 0.876388888888889 | 0 |
| 0.8770833333333333 | 0 |
| 0.8777777777777778 | 0 |
| 0.8784722222222222 | 0 |
| 0.8791666666666668 | 0 |
| 0.8798611111111111 | 0 |
| 0.8805555555555555 | 0 |
| 0.88125 | 0 |
| 0.8819444444444445 | 0 |
| 0.8826388888888889 | 0 |
| 0.8833333333333333 | 0 |
| 0.8840277777777777 | 0 |
| 0.8847222222222223 | 0 |
| 0.8854166666666666 | 0 |
| 0.8861111111111111 | 0 |
| 0.8868055555555556 | 0 |
| 0.8875000000000001 | 0 |
| 0.8881944444444444 | 0 |
| 0.8888888888888888 | 0 |
| 0.8895833333333334 | 0 |
| 0.8902777777777778 | 0 |
| 0.8909722222222222 | 0 |
| 0.8916666666666666 | 0 |
| 0.8923611111111112 | 0 |
| 0.8930555555555556 | 0 |
| 0.8937499999999999 | 0 |
| 0.8944444444444444 | 0 |
| 0.8951388888888889 | 0 |
| 0.8958333333333334 | 0 |
| 0.8965277777777777 | 0 |
| 0.8972222222222223 | 0 |
| 0.8979166666666667 | 0 |
| 0.8986111111111111 | 0 |
| 0.8993055555555555 | 0 |
| 0.9 | 0 |
| 0.9006944444444445 | 0 |
| 0.9013888888888889 | 0 |
| 0.9020833333333332 | 0 |
| 0.9027777777777778 | 0 |
| 0.9034722222222222 | 0 |
| 0.9041666666666667 | 0 |
| 0.904861111111111 | 0 |
| 0.9055555555555556 | 0 |
| 0.90625 | 0 |
| 0.9069444444444444 | 0 |
| 0.907638888888889 | 0 |
| 0.9083333333333333 | 0 |
| 0.9090277777777778 | 0 |
| 0.9097222222222222 | 0 |
| 0.9104166666666668 | 0 |
| 0.9111111111111111 | 0 |
| 0.9118055555555555 | 0 |
| 0.9125 | 0 |
| 0.9131944444444445 | 0 |
| 0.9138888888888889 | 0 |
| 0.9145833333333333 | 0 |
| 0.9152777777777777 | 0 |
| 0.9159722222222223 | 0 |
| 0.9166666666666666 | 0 |
| 0.9173611111111111 | 0 |
| 0.9180555555555556 | 0 |
| 0.9187500000000001 | 0 |
| 0.9194444444444444 | 0 |
| 0.9201388888888888 | 0 |
| 0.9208333333333334 | 0 |
| 0.9215277777777778 | 0 |
| 0.9222222222222222 | 0 |
| 0.9229166666666666 | 0 |
| 0.9236111111111112 | 0 |
| 0.9243055555555556 | 0 |
| 0.9249999999999999 | 0 |
| 0.9256944444444444 | 0 |
| 0.9263888888888889 | 0 |
| 0.9270833333333334 | 0 |
| 0.9277777777777777 | 0 |
| 0.9284722222222223 | 0 |
| 0.9291666666666667 | 0 |
| 0.9298611111111111 | 0 |
| 0.9305555555555555 | 0 |
| 0.93125 | 0 |
| 0.9319444444444445 | 0 |
| 0.9326388888888889 | 0 |
| 0.9333333333333332 | 0 |
| 0.9340277777777778 | 0 |
| 0.9347222222222222 | 0 |
| 0.9354166666666667 | 0 |
| 0.936111111111111 | 0 |
| 0.9368055555555556 | 0 |
| 0.9375 | 0 |
| 0.9381944444444444 | 0 |
| 0.938888888888889 | 0 |
| 0.9395833333333333 | 0 |
| 0.9402777777777778 | 0 |
| 0.9409722222222222 | 0 |
| 0.9416666666666668 | 0 |
| 0.9423611111111111 | 0 |
| 0.9430555555555555 | 0 |
| 0.94375 | 0 |
| 0.9444444444444445 | 0 |
| 0.9451388888888889 | 0 |
| 0.9458333333333333 | 0 |
| 0.9465277777777777 | 0 |
| 0.9472222222222223 | 0 |
| 0.9479166666666666 | 0 |
| 0.9486111111111111 | 0 |
| 0.9493055555555556 | 0 |
| 0.9500000000000001 | 0 |
| 0.9506944444444444 | 0 |
| 0.9513888888888888 | 0 |
| 0.9520833333333334 | 0 |
| 0.9527777777777778 | 0 |
| 0.9534722222222222 | 0 |
| 0.9541666666666666 | 0 |
| 0.9548611111111112 | 0 |
| 0.9555555555555556 | 0 |
| 0.9562499999999999 | 0 |
| 0.9569444444444444 | 0 |
| 0.9576388888888889 | 0 |
| 0.9583333333333334 | 0 |
| 0.9590277777777777 | 0 |
| 0.9597222222222223 | 0 |
| 0.9604166666666667 | 0 |
| 0.9611111111111111 | 0 |
| 0.9618055555555555 | 0 |
| 0.9625 | 0 |
| 0.9631944444444445 | 0 |
| 0.9638888888888889 | 0 |
| 0.9645833333333332 | 0 |
| 0.9652777777777778 | 0 |
| 0.9659722222222222 | 0 |
| 0.9666666666666667 | 0 |
| 0.967361111111111 | 0 |
| 0.9680555555555556 | 0 |
| 0.96875 | 0 |
| 0.9694444444444444 | 0 |
| 0.970138888888889 | 0 |
| 0.9708333333333333 | 0 |
| 0.9715277777777778 | 0 |
| 0.9722222222222222 | 0 |
| 0.9729166666666668 | 0 |
| 0.9736111111111111 | 0 |
| 0.9743055555555555 | 0 |
| 0.975 | 0 |
| 0.9756944444444445 | 0 |
| 0.9763888888888889 | 0 |
| 0.9770833333333333 | 0 |
| 0.9777777777777777 | 0 |
| 0.9784722222222223 | 0 |
| 0.9791666666666666 | 0 |
| 0.9798611111111111 | 0 |
| 0.9805555555555556 | 0 |
| 0.9812500000000001 | 0 |
| 0.9819444444444444 | 0 |
| 0.9826388888888888 | 0 |
| 0.9833333333333334 | 0 |
| 0.9840277777777778 | 0 |
| 0.9847222222222222 | 0 |
| 0.9854166666666666 | 0 |
| 0.9861111111111112 | 0 |
| 0.9868055555555556 | 0 |
| 0.9874999999999999 | 0 |
| 0.9881944444444444 | 0 |
| 0.9888888888888889 | 0 |
| 0.9895833333333334 | 0 |
| 0.9902777777777777 | 0 |
| 0.9909722222222223 | 0 |
| 0.9916666666666667 | 0 |
| 0.9923611111111111 | 0 |
| 0.9930555555555555 | 0 |
| 0.99375 | 0 |
| 0.9944444444444445 | 0 |
| 0.9951388888888889 | 0 |
| 0.9958333333333332 | 0 |
| 0.9965277777777778 | 0 |
| 0.9972222222222222 | 0 |
| 0.9979166666666667 | 0 |
| 0.998611111111111 | 0 |
| 0.9993055555555556 | 0 |